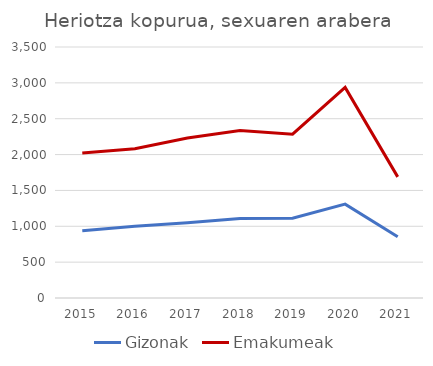
| Category | Gizonak | Emakumeak |
|---|---|---|
| 2015.0 | 937 | 2022 |
| 2016.0 | 1001 | 2082 |
| 2017.0 | 1049 | 2232 |
| 2018.0 | 1110 | 2336 |
| 2019.0 | 1112 | 2284 |
| 2020.0 | 1309 | 2937 |
| 2021.0 | 853 | 1689 |